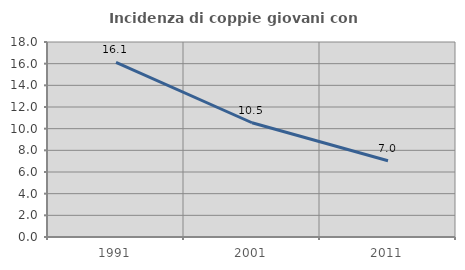
| Category | Incidenza di coppie giovani con figli |
|---|---|
| 1991.0 | 16.116 |
| 2001.0 | 10.546 |
| 2011.0 | 7.044 |